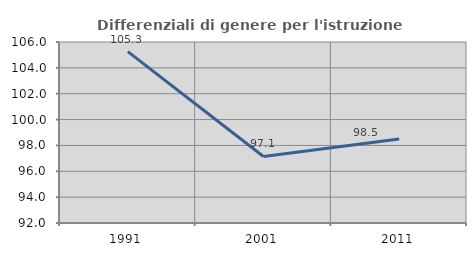
| Category | Differenziali di genere per l'istruzione superiore |
|---|---|
| 1991.0 | 105.254 |
| 2001.0 | 97.148 |
| 2011.0 | 98.496 |